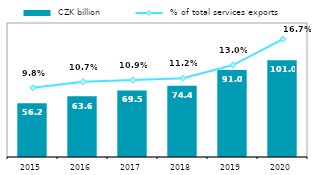
| Category |  CZK billion |
|---|---|
| 2015.0 | 56.164 |
| 2016.0 | 63.584 |
| 2017.0 | 69.518 |
| 2018.0 | 74.364 |
| 2019.0 | 91 |
| 2020.0 | 101.013 |